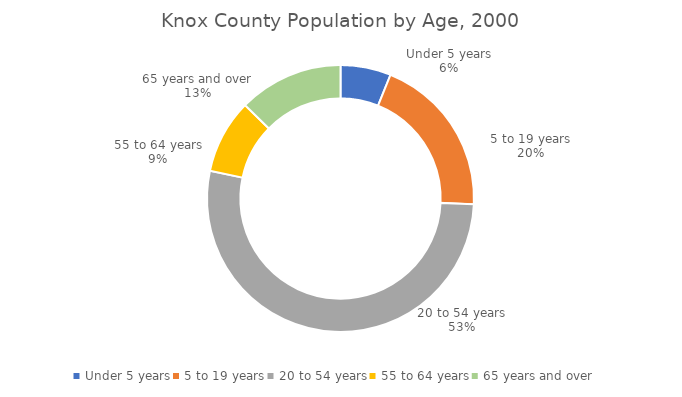
| Category | Knox County |
|---|---|
| Under 5 years | 23371 |
| 5 to 19 years | 74806 |
| 20 to 54 years | 201107 |
| 55 to 64 years | 34333 |
| 65 years and over | 48415 |